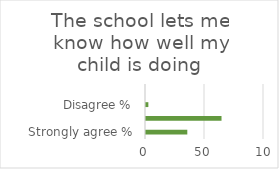
| Category | Series 1 |
|---|---|
| Strongly agree % | 35 |
| Agree % | 64 |
| Disagree % | 2 |
| Strongly disagree % | 0 |